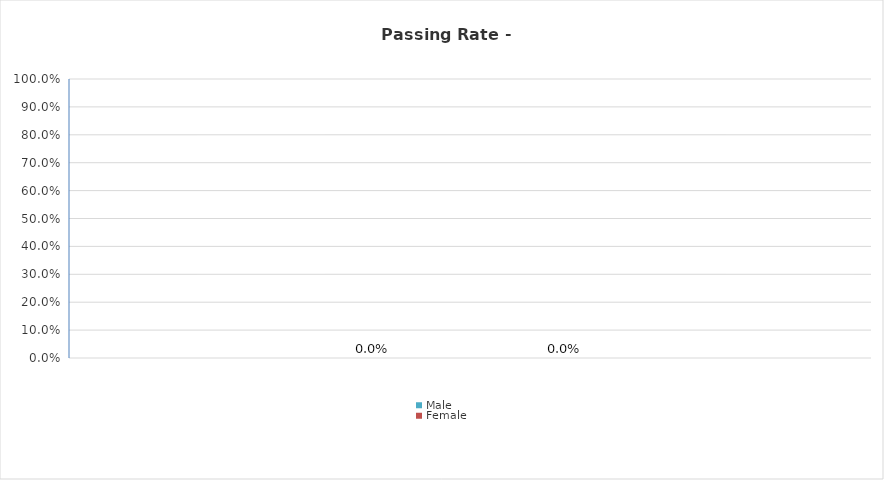
| Category | Male | Female |
|---|---|---|
| Passing rate percentage | 0 | 0 |